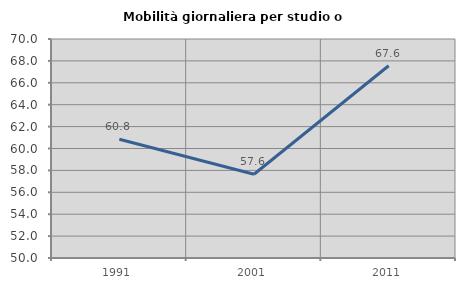
| Category | Mobilità giornaliera per studio o lavoro |
|---|---|
| 1991.0 | 60.85 |
| 2001.0 | 57.646 |
| 2011.0 | 67.554 |